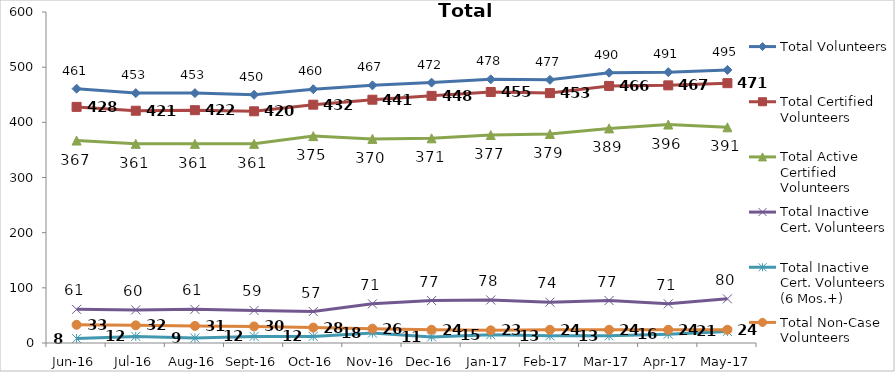
| Category | Total Volunteers | Total Certified Volunteers | Total Active Certified Volunteers | Total Inactive Cert. Volunteers | Total Inactive Cert. Volunteers (6 Mos.+) | Total Non-Case Volunteers |
|---|---|---|---|---|---|---|
| Jun-16 | 461 | 428 | 367 | 61 | 8 | 33 |
| Jul-16 | 453 | 421 | 361 | 60 | 12 | 32 |
| Aug-16 | 453 | 422 | 361 | 61 | 9 | 31 |
| Sep-16 | 450 | 420 | 361 | 59 | 12 | 30 |
| Oct-16 | 460 | 432 | 375 | 57 | 12 | 28 |
| Nov-16 | 467 | 441 | 370 | 71 | 18 | 26 |
| Dec-16 | 472 | 448 | 371 | 77 | 11 | 24 |
| Jan-17 | 478 | 455 | 377 | 78 | 15 | 23 |
| Feb-17 | 477 | 453 | 379 | 74 | 13 | 24 |
| Mar-17 | 490 | 466 | 389 | 77 | 13 | 24 |
| Apr-17 | 491 | 467 | 396 | 71 | 16 | 24 |
| May-17 | 495 | 471 | 391 | 80 | 21 | 24 |